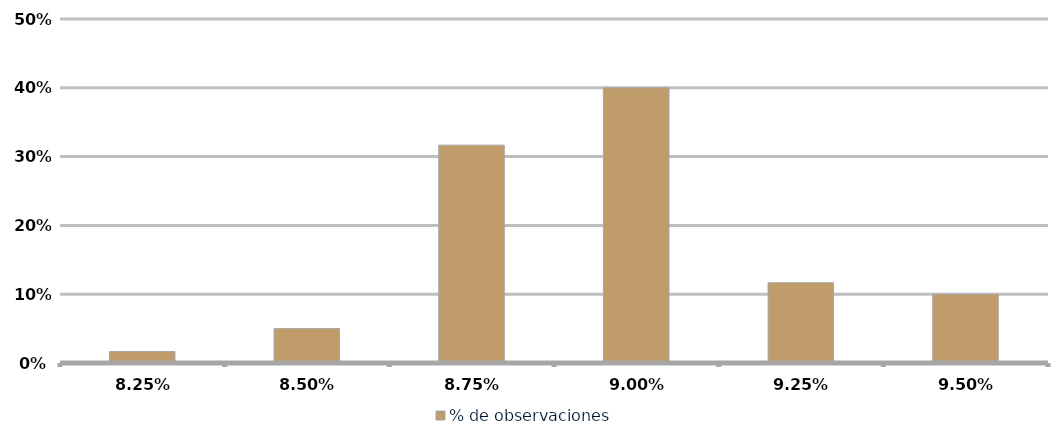
| Category | % de observaciones  |
|---|---|
| 0.08249999999999999 | 0.017 |
| 0.08499999999999999 | 0.05 |
| 0.0875 | 0.317 |
| 0.09 | 0.4 |
| 0.0925 | 0.117 |
| 0.095 | 0.1 |